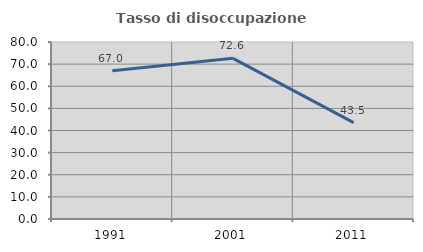
| Category | Tasso di disoccupazione giovanile  |
|---|---|
| 1991.0 | 67.021 |
| 2001.0 | 72.603 |
| 2011.0 | 43.548 |